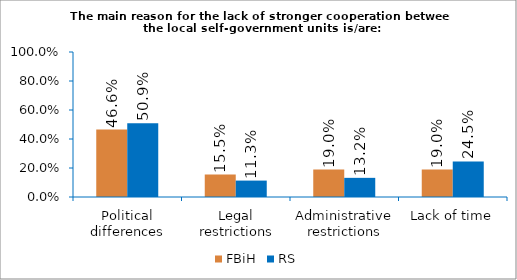
| Category | FBiH | RS |
|---|---|---|
| Political differences | 0.466 | 0.509 |
| Legal restrictions | 0.155 | 0.113 |
| Administrative restrictions | 0.19 | 0.132 |
| Lack of time | 0.19 | 0.245 |